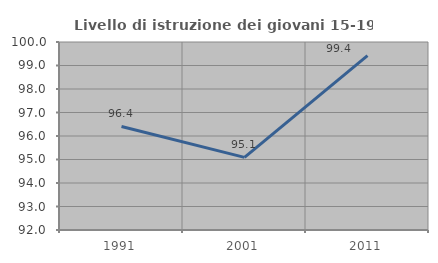
| Category | Livello di istruzione dei giovani 15-19 anni |
|---|---|
| 1991.0 | 96.407 |
| 2001.0 | 95.092 |
| 2011.0 | 99.419 |